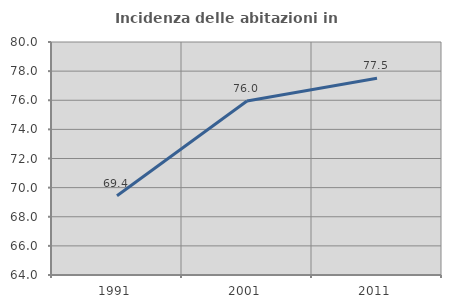
| Category | Incidenza delle abitazioni in proprietà  |
|---|---|
| 1991.0 | 69.441 |
| 2001.0 | 75.952 |
| 2011.0 | 77.509 |